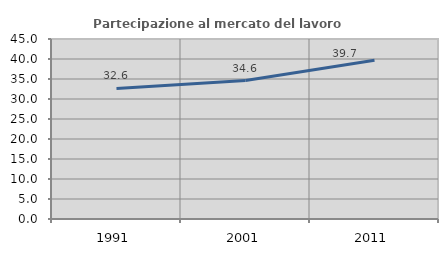
| Category | Partecipazione al mercato del lavoro  femminile |
|---|---|
| 1991.0 | 32.648 |
| 2001.0 | 34.608 |
| 2011.0 | 39.696 |